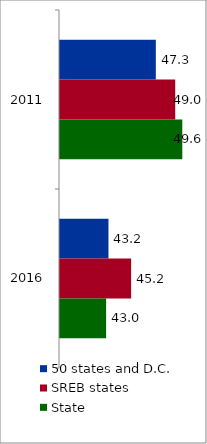
| Category | 50 states and D.C. | SREB states | State |
|---|---|---|---|
| 2011.0 | 47.332 | 49.02 | 49.634 |
| 2016.0 | 43.214 | 45.186 | 43.01 |